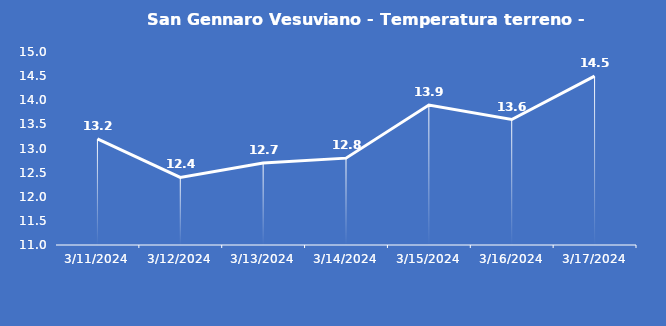
| Category | San Gennaro Vesuviano - Temperatura terreno - Grezzo (°C) |
|---|---|
| 3/11/24 | 13.2 |
| 3/12/24 | 12.4 |
| 3/13/24 | 12.7 |
| 3/14/24 | 12.8 |
| 3/15/24 | 13.9 |
| 3/16/24 | 13.6 |
| 3/17/24 | 14.5 |